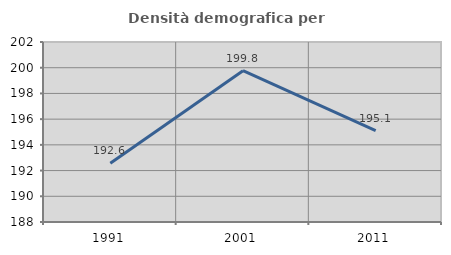
| Category | Densità demografica |
|---|---|
| 1991.0 | 192.573 |
| 2001.0 | 199.766 |
| 2011.0 | 195.111 |